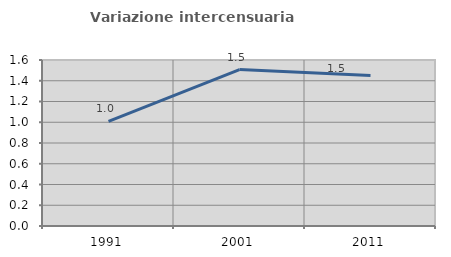
| Category | Variazione intercensuaria annua |
|---|---|
| 1991.0 | 1.009 |
| 2001.0 | 1.507 |
| 2011.0 | 1.451 |